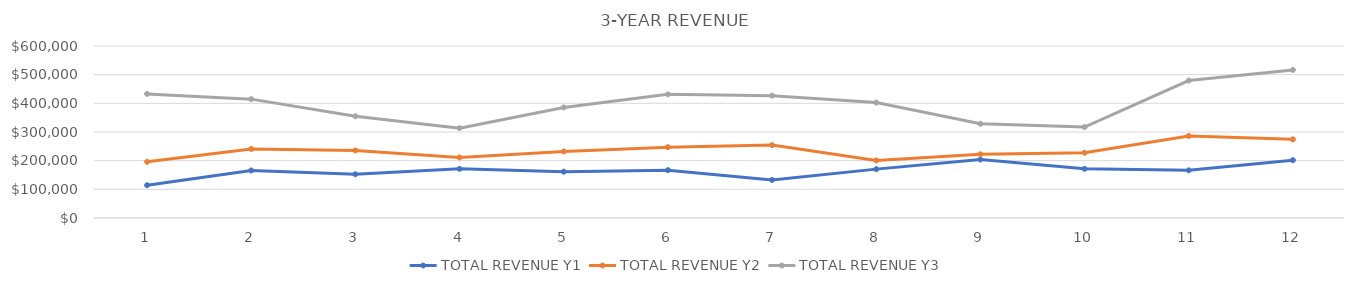
| Category | TOTAL REVENUE Y1 | TOTAL REVENUE Y2 | TOTAL REVENUE Y3 |
|---|---|---|---|
| 0 | 114350 | 195956 | 432976 |
| 1 | 165800 | 240945 | 414652 |
| 2 | 152557 | 235555 | 354787 |
| 3 | 171421 | 211305 | 313504 |
| 4 | 161618 | 232213 | 385676 |
| 5 | 166870 | 247021 | 431520 |
| 6 | 132884 | 254266 | 426803 |
| 7 | 170481 | 200836 | 402533 |
| 8 | 203968 | 222280 | 328813 |
| 9 | 171681 | 227616 | 317269 |
| 10 | 166247 | 286221 | 479413 |
| 11 | 201651 | 274416 | 516463 |